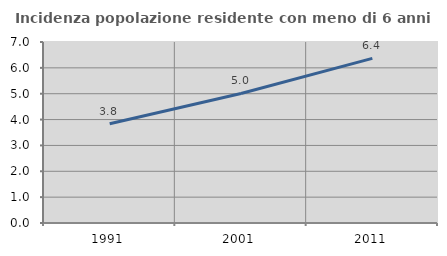
| Category | Incidenza popolazione residente con meno di 6 anni |
|---|---|
| 1991.0 | 3.839 |
| 2001.0 | 5.01 |
| 2011.0 | 6.367 |